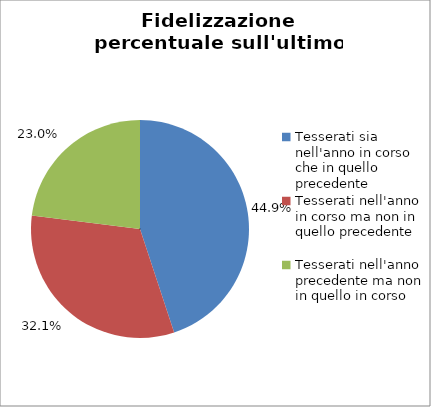
| Category | Nr. Tesserati |
|---|---|
| Tesserati sia nell'anno in corso che in quello precedente | 359 |
| Tesserati nell'anno in corso ma non in quello precedente | 256 |
| Tesserati nell'anno precedente ma non in quello in corso | 184 |